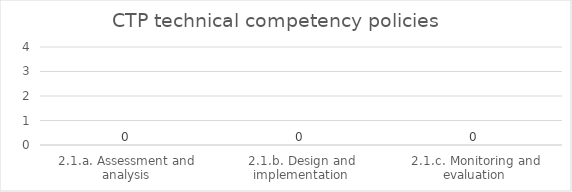
| Category | CTP technical competency policies |
|---|---|
| 2.1.a. Assessment and analysis | 0 |
| 2.1.b. Design and implementation | 0 |
| 2.1.c. Monitoring and evaluation | 0 |